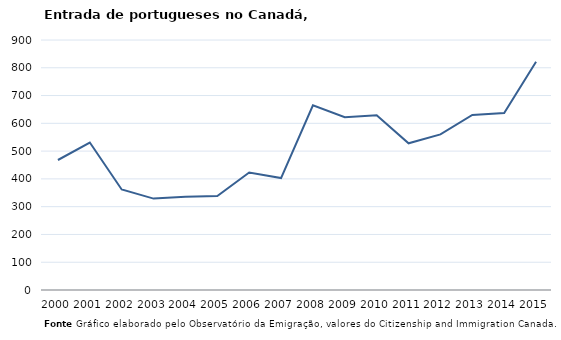
| Category | Entradas |
|---|---|
| 2000.0 | 468 |
| 2001.0 | 531 |
| 2002.0 | 362 |
| 2003.0 | 329 |
| 2004.0 | 336 |
| 2005.0 | 338 |
| 2006.0 | 423 |
| 2007.0 | 403 |
| 2008.0 | 665 |
| 2009.0 | 622 |
| 2010.0 | 629 |
| 2011.0 | 528 |
| 2012.0 | 560 |
| 2013.0 | 630 |
| 2014.0 | 637 |
| 2015.0 | 822 |